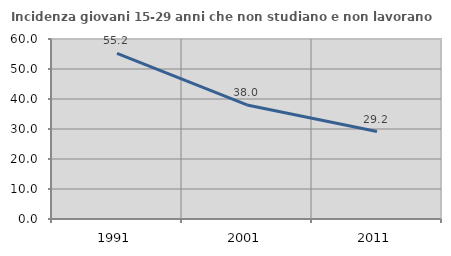
| Category | Incidenza giovani 15-29 anni che non studiano e non lavorano  |
|---|---|
| 1991.0 | 55.198 |
| 2001.0 | 38.022 |
| 2011.0 | 29.167 |